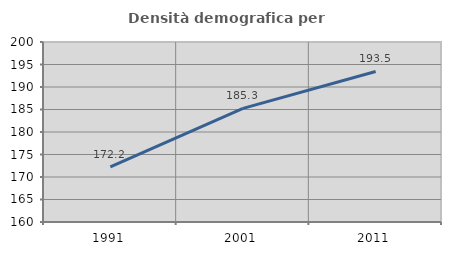
| Category | Densità demografica |
|---|---|
| 1991.0 | 172.243 |
| 2001.0 | 185.253 |
| 2011.0 | 193.455 |